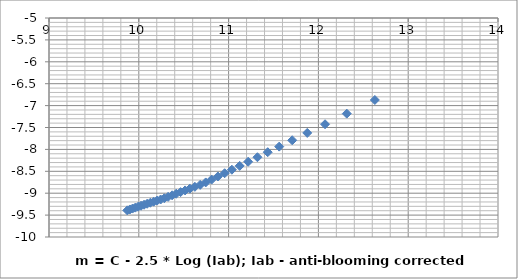
| Category | Series 0 |
|---|---|
| 9.871833313864176 | -9.392 |
| 9.900787995238714 | -9.371 |
| 9.930536053487984 | -9.351 |
| 9.961122194530512 | -9.329 |
| 9.992595012800564 | -9.308 |
| 10.025007455711483 | -9.286 |
| 10.058417359606436 | -9.264 |
| 10.092888070820518 | -9.241 |
| 10.128489168607045 | -9.217 |
| 10.165297310658811 | -9.194 |
| 10.203397227050653 | -9.169 |
| 10.242882895008734 | -9.144 |
| 10.283858935479156 | -9.116 |
| 10.326442283726106 | -9.084 |
| 10.370764201127185 | -9.049 |
| 10.416972715362219 | -9.012 |
| 10.465235603350685 | -8.975 |
| 10.515744068571403 | -8.936 |
| 10.568717316246248 | -8.896 |
| 10.624408303024127 | -8.855 |
| 10.683111042647937 | -8.81 |
| 10.745170001960517 | -8.754 |
| 10.810992348766389 | -8.689 |
| 10.881064157766998 | -8.619 |
| 10.955972216210606 | -8.544 |
| 11.036433924639109 | -8.464 |
| 11.123339190287139 | -8.377 |
| 11.217810592510638 | -8.282 |
| 11.321292305406201 | -8.179 |
| 11.435686031807888 | -8.064 |
| 11.563567337926342 | -7.936 |
| 11.708547205370559 | -7.791 |
| 11.875914179447092 | -7.624 |
| 12.073867294566154 | -7.426 |
| 12.316142327086295 | -7.184 |
| 12.628489168607045 | -6.872 |